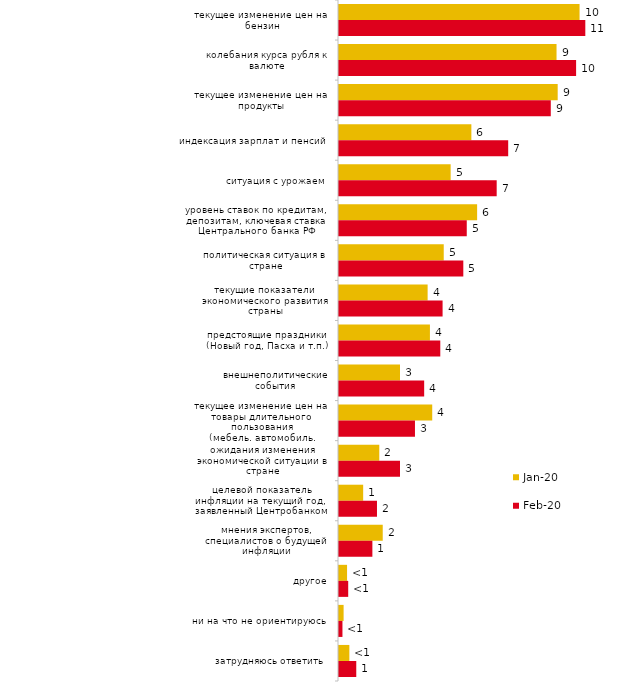
| Category | янв.20 | фев.20 |
|---|---|---|
| текущее изменение цен на бензин | 10.347 | 10.594 |
| колебания курса рубля к валюте | 9.356 | 10.198 |
| текущее изменение цен на продукты | 9.406 | 9.109 |
| индексация зарплат и пенсий | 5.693 | 7.277 |
| ситуация с урожаем | 4.802 | 6.782 |
| уровень ставок по кредитам, депозитам, ключевая ставка Центрального банка РФ | 5.941 | 5.495 |
| политическая ситуация в стране | 4.505 | 5.347 |
| текущие показатели экономического развития страны | 3.812 | 4.455 |
| предстоящие праздники (Новый год, Пасха и т.п.) | 3.911 | 4.356 |
| внешнеполитические события | 2.624 | 3.663 |
| текущее изменение цен на товары длительного пользования (мебель, автомобиль, бытовая техника и т.п.) | 4.01 | 3.267 |
| ожидания изменения экономической ситуации в стране | 1.733 | 2.624 |
| целевой показатель инфляции на текущий год, заявленный Центробанком | 1.04 | 1.634 |
| мнения экспертов, специалистов о будущей инфляции | 1.881 | 1.436 |
| другое | 0.347 | 0.396 |
| ни на что не ориентируюсь | 0.198 | 0.149 |
| затрудняюсь ответить | 0.446 | 0.743 |